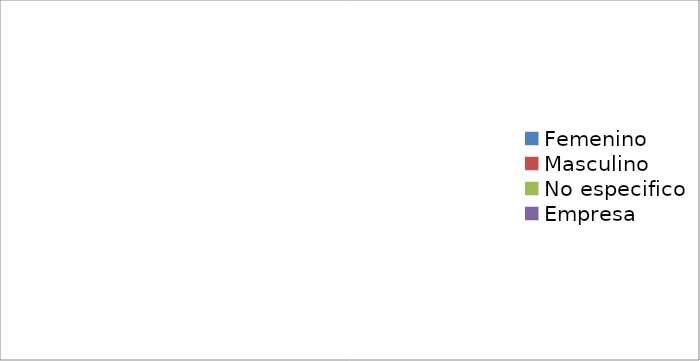
| Category | Series 0 |
|---|---|
| Femenino | 0 |
| Masculino | 0 |
| No especifico | 0 |
| Empresa | 0 |